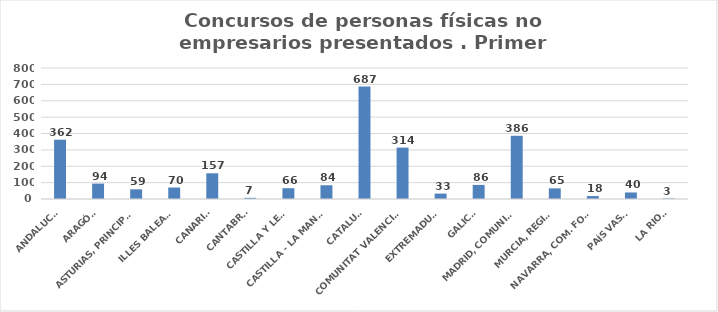
| Category | Series 0 |
|---|---|
| ANDALUCÍA | 362 |
| ARAGÓN | 94 |
| ASTURIAS, PRINCIPADO | 59 |
| ILLES BALEARS | 70 |
| CANARIAS | 157 |
| CANTABRIA | 7 |
| CASTILLA Y LEÓN | 66 |
| CASTILLA - LA MANCHA | 84 |
| CATALUÑA | 687 |
| COMUNITAT VALENCIANA | 314 |
| EXTREMADURA | 33 |
| GALICIA | 86 |
| MADRID, COMUNIDAD | 386 |
| MURCIA, REGIÓN | 65 |
| NAVARRA, COM. FORAL | 18 |
| PAÍS VASCO | 40 |
| LA RIOJA | 3 |